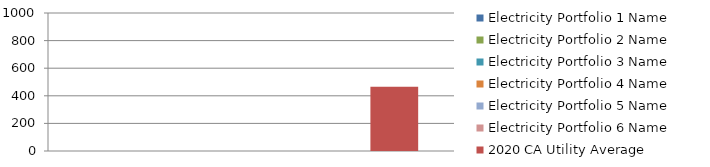
| Category | Electricity Portfolio 1 Name | Electricity Portfolio 2 Name | Electricity Portfolio 3 Name | Electricity Portfolio 4 Name | Electricity Portfolio 5 Name | Electricity Portfolio 6 Name | 2020 CA Utility Average |
|---|---|---|---|---|---|---|---|
| 0 | 0 | 0 | 0 | 0 | 0 | 0 | 466 |